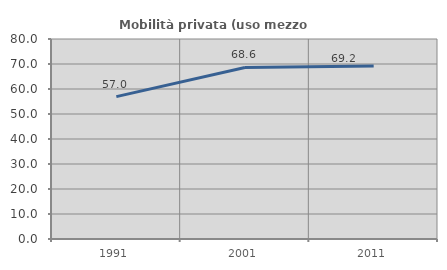
| Category | Mobilità privata (uso mezzo privato) |
|---|---|
| 1991.0 | 56.96 |
| 2001.0 | 68.618 |
| 2011.0 | 69.224 |